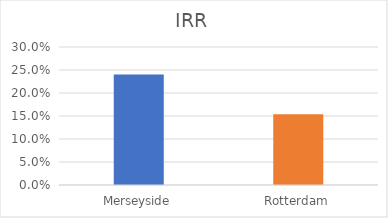
| Category | Series 0 |
|---|---|
| Merseyside | 0.24 |
| Rotterdam | 0.154 |